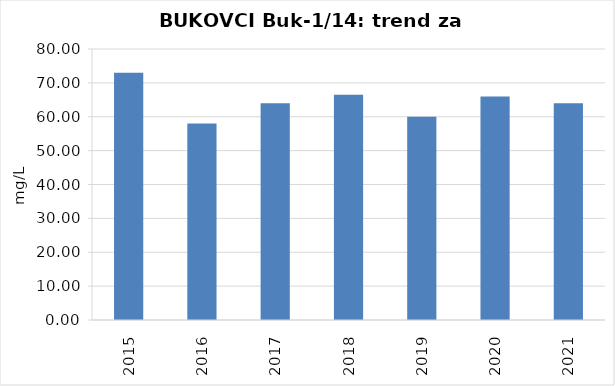
| Category | Vsota |
|---|---|
| 2015 | 73 |
| 2016 | 58 |
| 2017 | 64 |
| 2018 | 66.5 |
| 2019 | 60 |
| 2020 | 66 |
| 2021 | 64 |